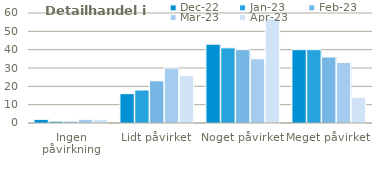
| Category | dec-22 | jan-23 | feb-23 | mar-23 | apr-23 |
|---|---|---|---|---|---|
| Ingen påvirkning | 2 | 1 | 1 | 2 | 2 |
| Lidt påvirket | 16 | 18 | 23 | 30 | 26 |
| Noget påvirket | 43 | 41 | 40 | 35 | 57 |
| Meget påvirket | 40 | 40 | 36 | 33 | 14 |